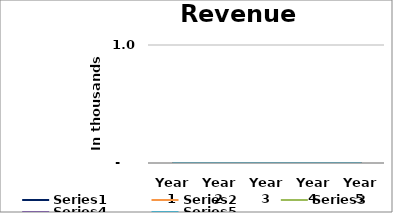
| Category | Series1 | Series2 | Series3 | Series4 | Series5 |
|---|---|---|---|---|---|
| Year 1 | 0 | 0 | 0 | 0 | 0 |
| Year 2 | 0 | 0 | 0 | 0 | 0 |
| Year 3 | 0 | 0 | 0 | 0 | 0 |
| Year 4 | 0 | 0 | 0 | 0 | 0 |
| Year 5 | 0 | 0 | 0 | 0 | 0 |